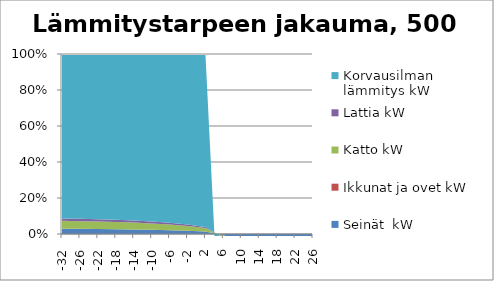
| Category | Seinät  kW | Ikkunat ja ovet kW | Katto kW | Lattia kW | Korvausilman lämmitys kW |
|---|---|---|---|---|---|
| -32.0 | 7.392 | 0 | 10.92 | 3.276 | 228.929 |
| -26.0 | 6.125 | 0 | 9.048 | 2.714 | 194.974 |
| -22.0 | 5.28 | 0 | 7.8 | 2.34 | 172.9 |
| -18.0 | 4.435 | 0 | 6.552 | 1.966 | 151.171 |
| -14.0 | 3.59 | 0 | 5.304 | 1.591 | 129.542 |
| -10.0 | 2.746 | 0 | 4.056 | 1.217 | 107.487 |
| -6.0 | 1.901 | 0 | 2.808 | 0.842 | 83.866 |
| -2.0 | 1.056 | 0 | 1.56 | 0.468 | 55.906 |
| 2.0 | 0.211 | 0 | 0.312 | 0.094 | 15.105 |
| 6.0 | -0.634 | 0 | -0.936 | -0.281 | -82.662 |
| 10.0 | -1.478 | 0 | -2.184 | -0.655 | -33.261 |
| 14.0 | -2.323 | 0 | -3.432 | -1.03 | -52.268 |
| 18.0 | -3.168 | 0 | -4.68 | -1.404 | -71.274 |
| 22.0 | -4.013 | 0 | -5.928 | -1.778 | -90.281 |
| 26.0 | -4.858 | 0 | -7.176 | -2.153 | -109.287 |